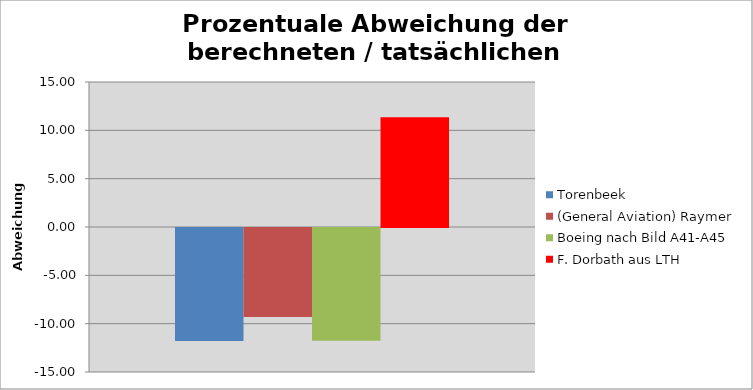
| Category | Torenbeek | (General Aviation) Raymer | Boeing nach Bild A41-A45 | F. Dorbath aus LTH |
|---|---|---|---|---|
| 0 | -11.686 | -9.208 | -11.654 | 11.362 |